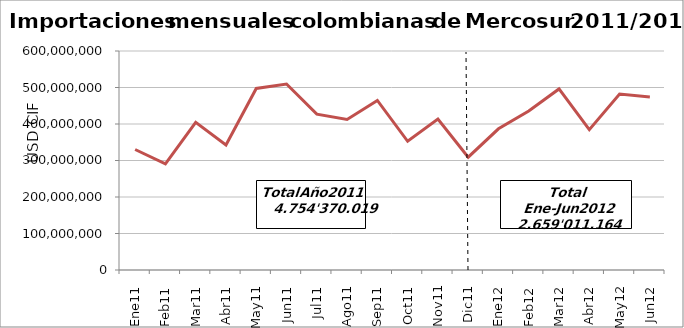
| Category | Series 0 |
|---|---|
| 0 | 330160374.31 |
| 1 | 291067927.3 |
| 2 | 404751248.07 |
| 3 | 342519702.37 |
| 4 | 497485870.25 |
| 5 | 509449724.22 |
| 6 | 426938982.95 |
| 7 | 412210100.53 |
| 8 | 464582861.48 |
| 9 | 352686344.97 |
| 10 | 413490004.37 |
| 11 | 309026878.56 |
| 12 | 386883999.34 |
| 13 | 435613049.98 |
| 14 | 496092136.99 |
| 15 | 384553222.89 |
| 16 | 481845222.24 |
| 17 | 474023532.58 |